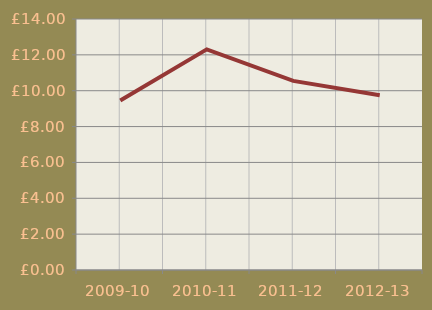
| Category | Allerdale |
|---|---|
| 2009-10 | 9.45 |
| 2010-11 | 12.305 |
| 2011-12 | 10.55 |
| 2012-13 | 9.751 |